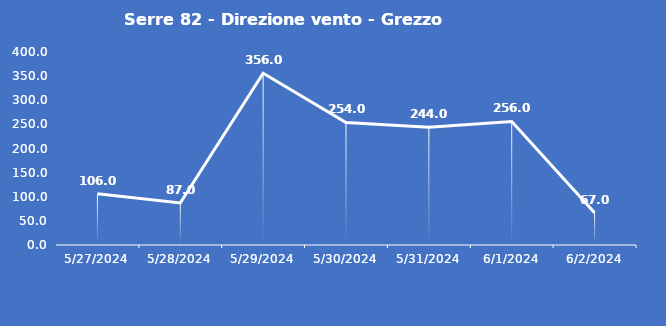
| Category | Serre 82 - Direzione vento - Grezzo (°N) |
|---|---|
| 5/27/24 | 106 |
| 5/28/24 | 87 |
| 5/29/24 | 356 |
| 5/30/24 | 254 |
| 5/31/24 | 244 |
| 6/1/24 | 256 |
| 6/2/24 | 67 |